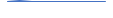
| Category | Series 0 |
|---|---|
| 0 | 0 |
| 1 | 1 |
| 2 | 0 |
| 3 | 0 |
| 4 | 0 |
| 5 | 0 |
| 6 | 0 |
| 7 | 0 |
| 8 | 0 |